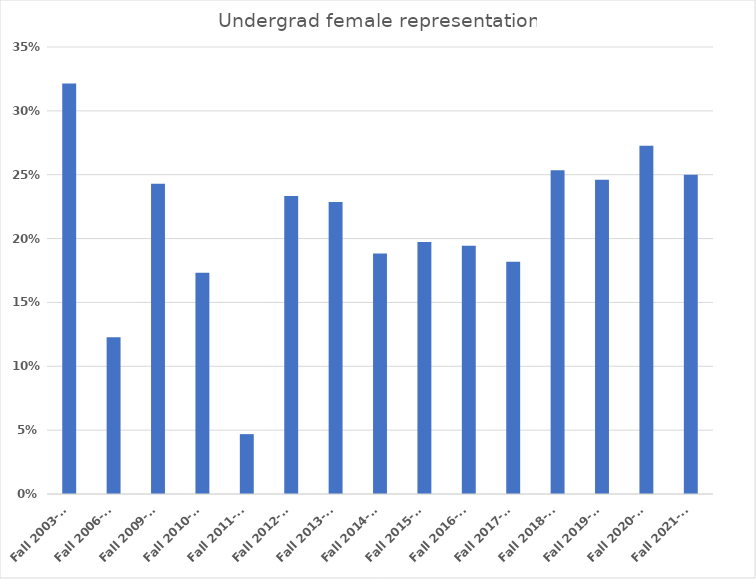
| Category | Undergrad female representation |
|---|---|
| Fall 2003-04 | 0.321 |
| Fall 2006-07 | 0.123 |
| Fall 2009-10 | 0.243 |
| Fall 2010-11 | 0.173 |
| Fall 2011-12 | 0.047 |
| Fall 2012-13 | 0.233 |
| Fall 2013-14 | 0.229 |
| Fall 2014-15 | 0.188 |
| Fall 2015-16 | 0.197 |
| Fall 2016-17 | 0.194 |
| Fall 2017-18 | 0.182 |
| Fall 2018-19 | 0.254 |
| Fall 2019-20 | 0.246 |
| Fall 2020-21 | 0.273 |
| Fall 2021-22 | 0.25 |